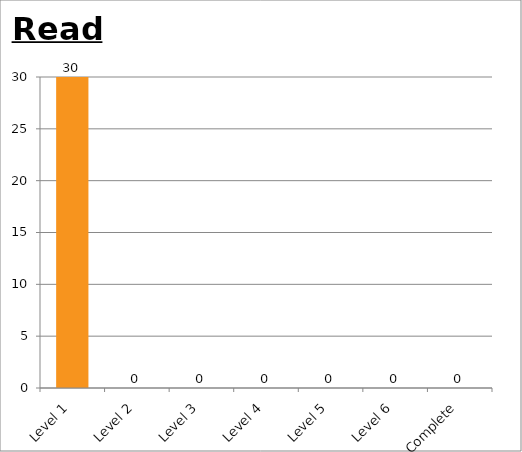
| Category | Series 0 |
|---|---|
| Level 1 | 30 |
| Level 2 | 0 |
| Level 3 | 0 |
| Level 4 | 0 |
| Level 5 | 0 |
| Level 6 | 0 |
| Complete | 0 |